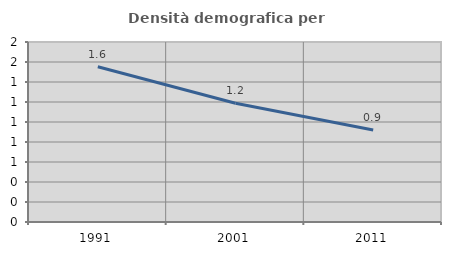
| Category | Densità demografica |
|---|---|
| 1991.0 | 1.552 |
| 2001.0 | 1.188 |
| 2011.0 | 0.92 |